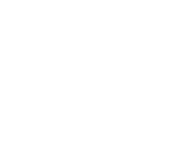
| Category | Series 0 |
|---|---|
| Research strategy | 0 |
| Project planning and delivery | 0 |
| Risk management | 0 |